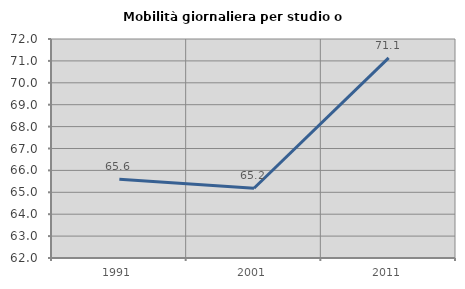
| Category | Mobilità giornaliera per studio o lavoro |
|---|---|
| 1991.0 | 65.599 |
| 2001.0 | 65.183 |
| 2011.0 | 71.14 |